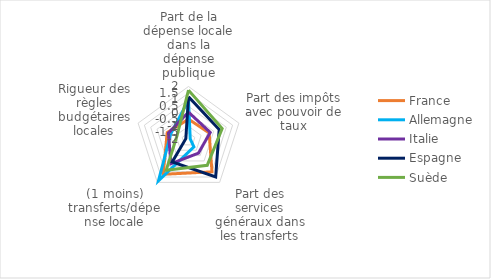
| Category | France | Allemagne | Italie | Espagne | Suède |
|---|---|---|---|---|---|
| Part de la dépense locale dans la dépense publique | -0.465 | 0.971 | 0.064 | 1.229 | 1.726 |
| Part des impôts avec pouvoir de taux | -0.364 | -1.864 | -0.275 | 0.434 | 0.671 |
| Part des services généraux dans les transferts | 1.017 | -1.307 | -0.726 | 1.49 | 0.402 |
| (1 moins) transferts/dépense locale | 1.246 | 1.854 | 0.264 | 0.089 | 0.861 |
| Rigueur des règles budgétaires locales | -0.308 | -0.594 | -0.411 | -1.789 | -1.087 |